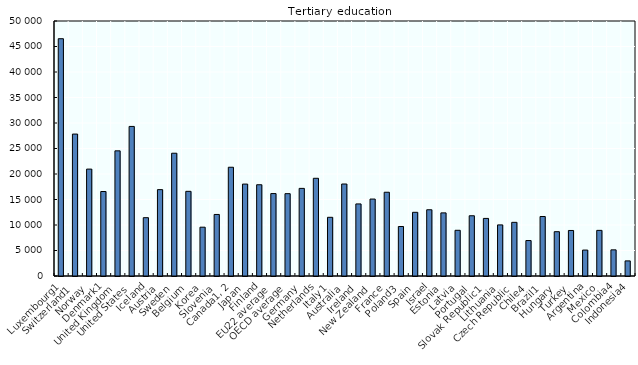
| Category | Series 0 |
|---|---|
| Luxembourg1 | 46526.14 |
| Switzerland1 | 27830.573 |
| Norway | 20961.632 |
| Denmark1 | 16568.214 |
| United Kingdom | 24541.552 |
| United States | 29328.235 |
| Iceland | 11434.985 |
| Austria | 16933.401 |
| Sweden | 24071.784 |
| Belgium | 16599.445 |
| Korea | 9570.4 |
| Slovenia | 12067.298 |
| Canada1, 2 | 21326.274 |
| Japan | 18022.211 |
| Finland | 17892.541 |
| EU22 average | 16164.184 |
| OECD average | 16143.071 |
| Germany | 17179.698 |
| Netherlands | 19158.968 |
| Italy1 | 11509.686 |
| Australia | 18037.512 |
| Ireland | 14130.998 |
| New Zealand | 15087.561 |
| France | 16422.299 |
| Poland3 | 9707.663 |
| Spain | 12488.88 |
| Israel | 12989.141 |
| Estonia | 12375.265 |
| Latvia | 8961.831 |
| Portugal | 11812.792 |
| Slovak Republic1 | 11290.387 |
| Lithuania | 10021.237 |
| Czech Republic | 10520.925 |
| Chile4 | 6951.927 |
| Brazil1 | 11666.285 |
| Hungary | 8688.093 |
| Turkey | 8927.184 |
| Argentina | 5085.053 |
| Mexico | 8948.92 |
| Colombia4 | 5125.672 |
| Indonesia4 | 2962.134 |